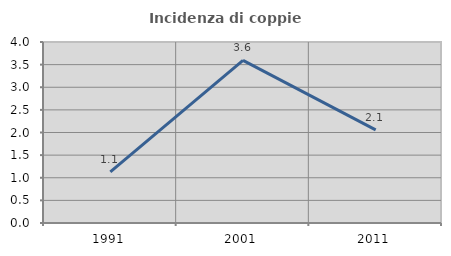
| Category | Incidenza di coppie miste |
|---|---|
| 1991.0 | 1.128 |
| 2001.0 | 3.593 |
| 2011.0 | 2.058 |